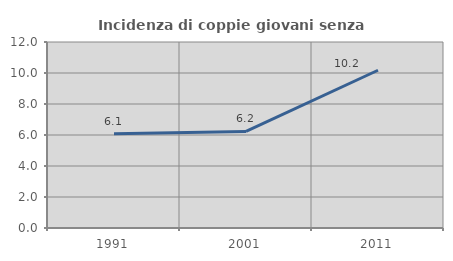
| Category | Incidenza di coppie giovani senza figli |
|---|---|
| 1991.0 | 6.076 |
| 2001.0 | 6.232 |
| 2011.0 | 10.177 |